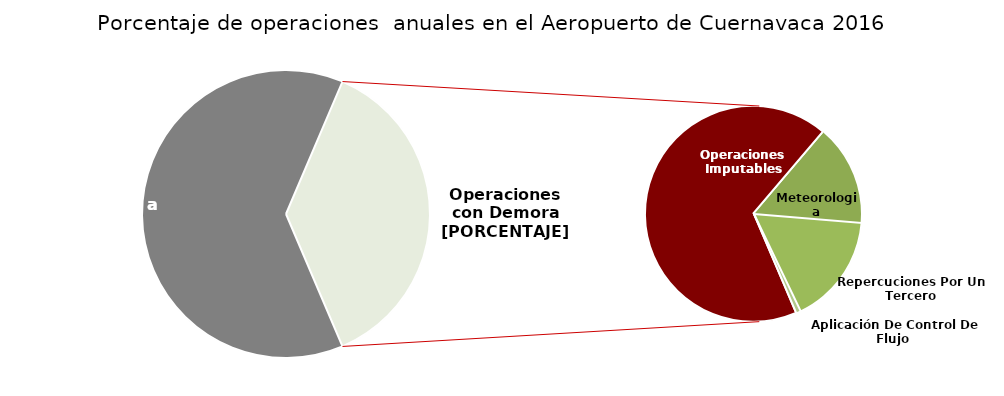
| Category | Series 0 |
|---|---|
| Operaciones a Tiempo | 235 |
| Operaciones Imputables | 94 |
| Meteorologia | 21 |
| Repercuciones Por Un Tercero | 23 |
| Aplicación De Control De Flujo  | 1 |